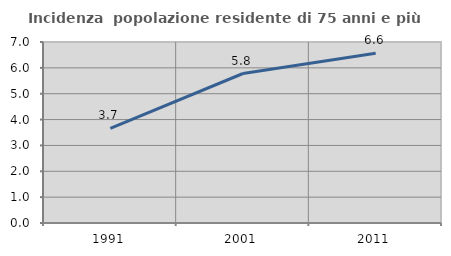
| Category | Incidenza  popolazione residente di 75 anni e più |
|---|---|
| 1991.0 | 3.656 |
| 2001.0 | 5.782 |
| 2011.0 | 6.565 |